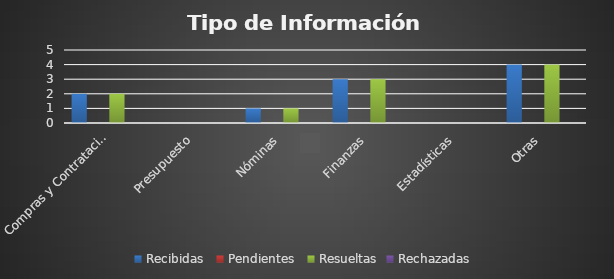
| Category | Recibidas  | Pendientes  | Resueltas | Rechazadas  |
|---|---|---|---|---|
| Compras y Contrataciones | 2 | 0 | 2 | 0 |
| Presupuesto | 0 | 0 | 0 | 0 |
| Nóminas | 1 | 0 | 1 | 0 |
| Finanzas | 3 | 0 | 3 | 0 |
| Estadísticas | 0 | 0 | 0 | 0 |
| Otras | 4 | 0 | 4 | 0 |